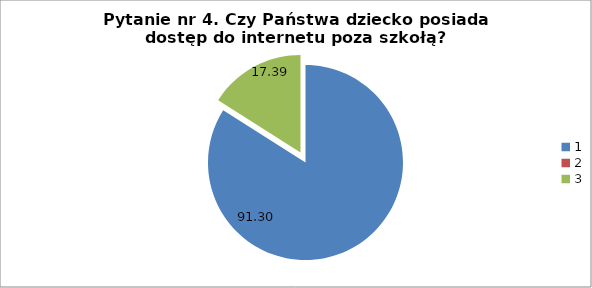
| Category | % |
|---|---|
| 0 | 91.304 |
| 1 | 0 |
| 2 | 17.391 |